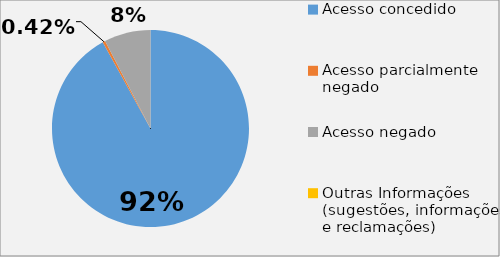
| Category | Series 2 |
|---|---|
| Acesso concedido | 0.919 |
| Acesso parcialmente negado | 0.004 |
| Acesso negado | 0.076 |
| Outras Informações (sugestões, informações e reclamações) | 0 |